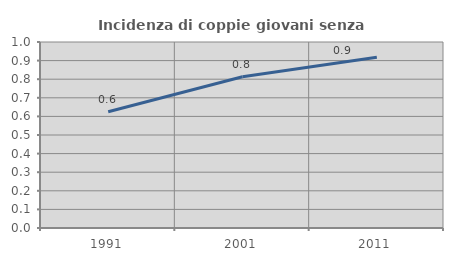
| Category | Incidenza di coppie giovani senza figli |
|---|---|
| 1991.0 | 0.625 |
| 2001.0 | 0.813 |
| 2011.0 | 0.917 |